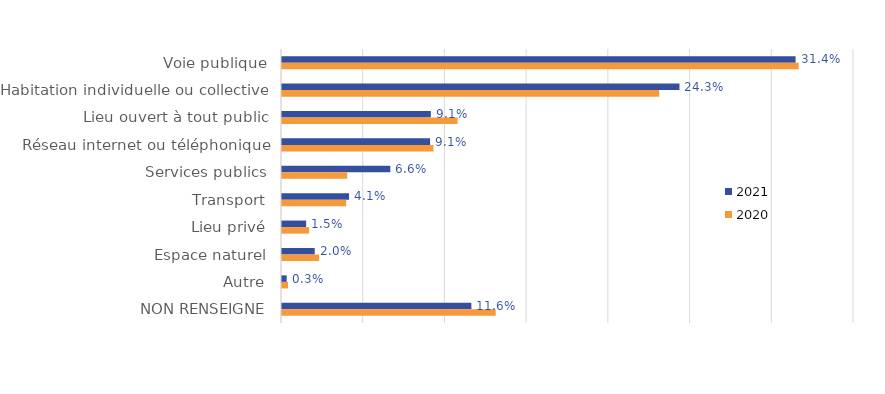
| Category | 2021 | 2020 |
|---|---|---|
| Voie publique | 0.314 | 0.316 |
| Habitation individuelle ou collective | 0.243 | 0.231 |
| Lieu ouvert à tout public | 0.091 | 0.107 |
| Réseau internet ou téléphonique | 0.091 | 0.093 |
| Services publics | 0.066 | 0.04 |
| Transport | 0.041 | 0.039 |
| Lieu privé | 0.015 | 0.017 |
| Espace naturel | 0.02 | 0.023 |
| Autre | 0.003 | 0.004 |
| NON RENSEIGNE | 0.116 | 0.131 |